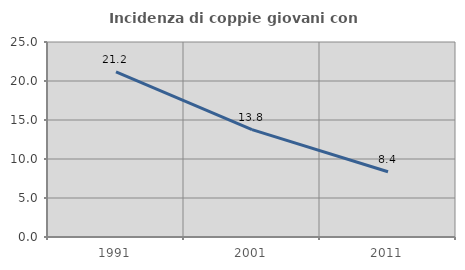
| Category | Incidenza di coppie giovani con figli |
|---|---|
| 1991.0 | 21.161 |
| 2001.0 | 13.761 |
| 2011.0 | 8.372 |